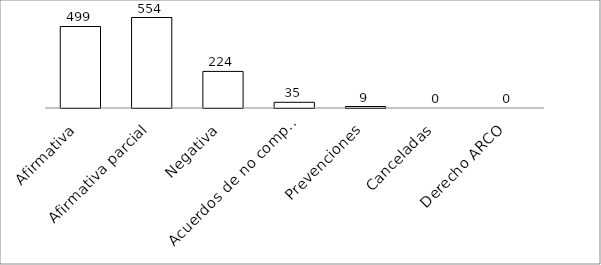
| Category | Series 0 |
|---|---|
| Afirmativa | 499 |
| Afirmativa parcial | 554 |
| Negativa | 224 |
| Acuerdos de no competencia | 35 |
| Prevenciones | 9 |
| Canceladas | 0 |
| Derecho ARCO | 0 |